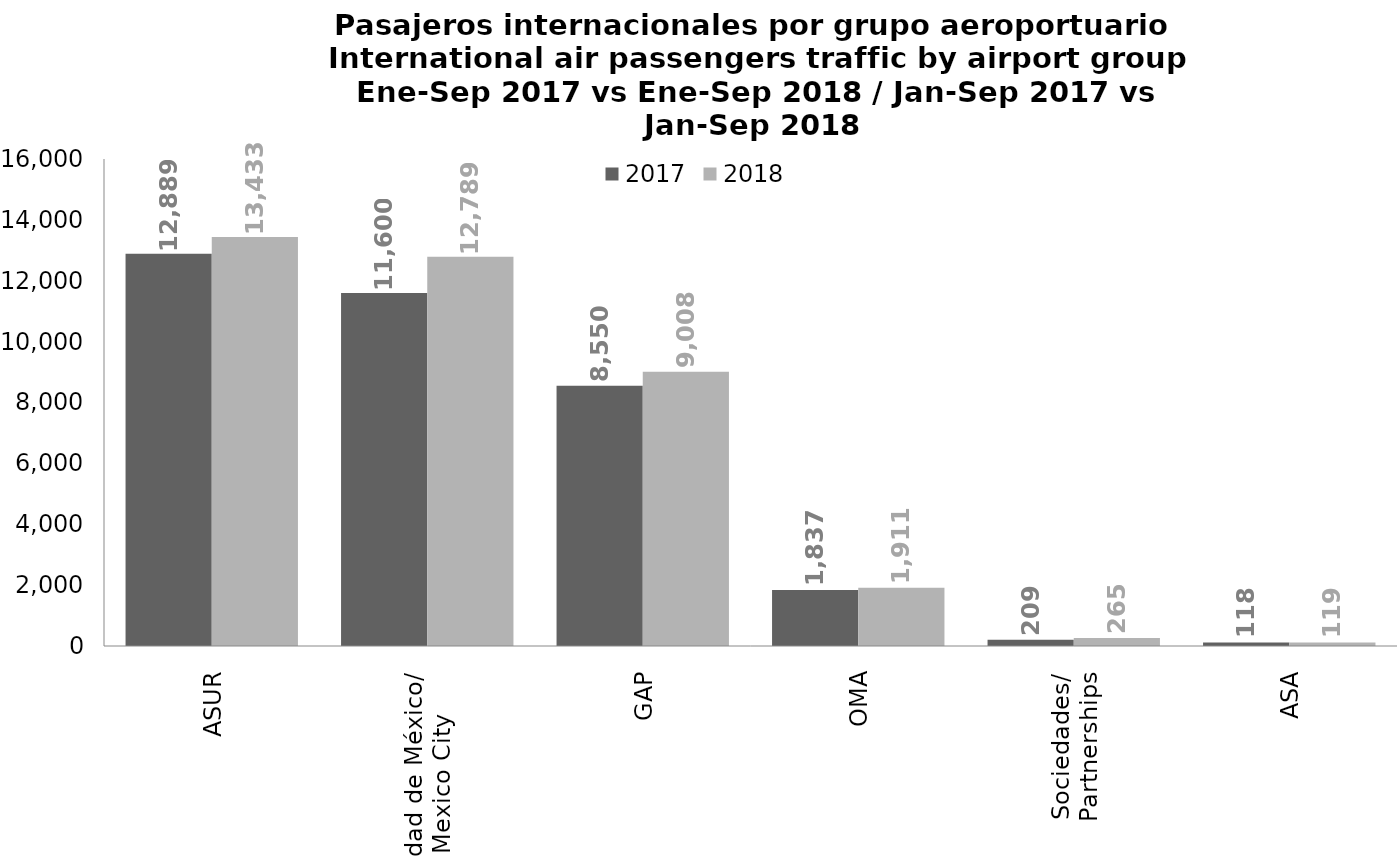
| Category | 2017 | 2018 |
|---|---|---|
| ASUR | 12888.713 | 13433.337 |
| Ciudad de México/
Mexico City | 11600.047 | 12789.056 |
| GAP | 8550.257 | 9007.985 |
| OMA | 1837.382 | 1911.139 |
| Sociedades/
Partnerships | 208.937 | 264.718 |
| ASA | 117.991 | 118.713 |